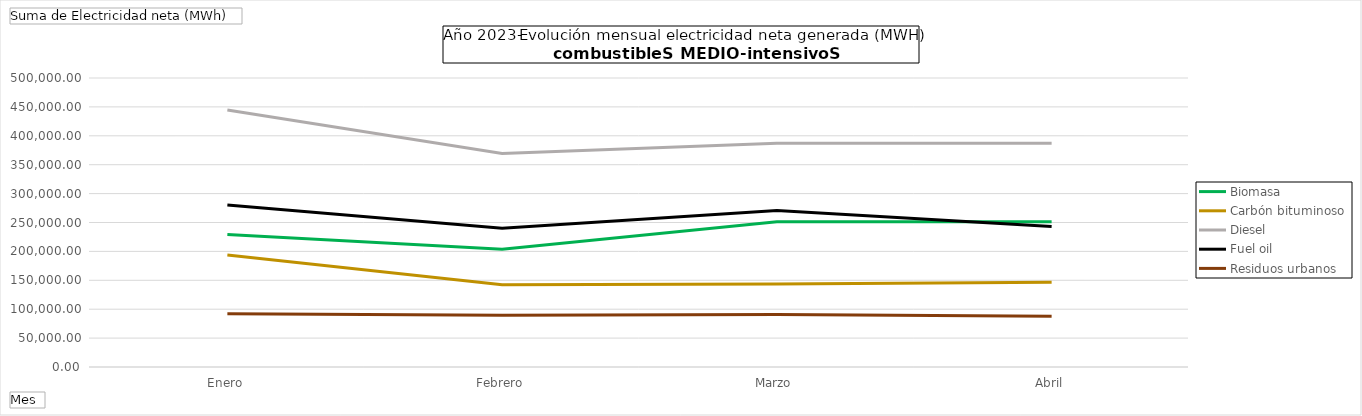
| Category | Biomasa | Carbón bituminoso | Diesel | Fuel oil | Residuos urbanos |
|---|---|---|---|---|---|
| Enero | 229179.683 | 193905.33 | 444569.713 | 280174.75 | 91944.503 |
| Febrero | 203764.77 | 142331.54 | 369325.377 | 240211.71 | 89673.74 |
| Marzo | 251376.29 | 143393.26 | 387293.057 | 270620.45 | 90653.12 |
| Abril | 251206.26 | 146600.64 | 386955.35 | 243119.01 | 87845.94 |